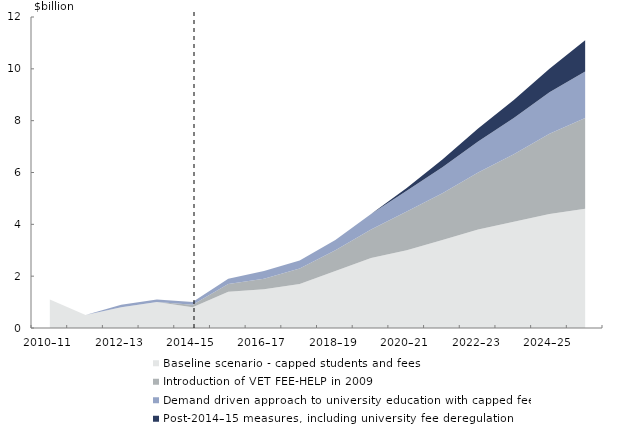
| Category | Baseline scenario - capped students and fees  | Introduction of VET FEE-HELP in 2009 | Demand driven approach to university education with capped fees | Post-2014–15 measures, including university fee deregulation  |
|---|---|---|---|---|
| 2010–11 | 1.1 | 0 | 0 | 0 |
| 2011–12 | 0.5 | 0 | 0 | 0 |
| 2012–13 | 0.8 | 0 | 0.1 | 0 |
| 2013–14 | 1 | 0 | 0.1 | 0 |
| 2014–15 | 0.8 | 0.1 | 0.1 | 0 |
| 2015–16 | 1.4 | 0.3 | 0.2 | 0 |
| 2016–17 | 1.5 | 0.4 | 0.3 | 0 |
| 2017–18 | 1.7 | 0.6 | 0.3 | 0 |
| 2018–19 | 2.2 | 0.8 | 0.4 | 0 |
| 2019–20 | 2.7 | 1.1 | 0.6 | 0 |
| 2020–21 | 3 | 1.5 | 0.8 | 0.1 |
| 2021–22 | 3.4 | 1.8 | 1 | 0.3 |
| 2022–23 | 3.8 | 2.2 | 1.2 | 0.5 |
| 2023–24 | 4.1 | 2.6 | 1.4 | 0.7 |
| 2024–25 | 4.4 | 3.1 | 1.6 | 0.9 |
| 2025–26 | 4.6 | 3.5 | 1.8 | 1.2 |